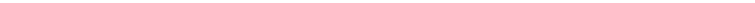
| Category | Series 0 |
|---|---|
| 2002-09-30 | 59.233 |
| 2003-09-30 | 60.724 |
| 2004-09-30 | 62.402 |
| 2005-09-30 | 65.523 |
| 2006-09-30 | 67.222 |
| 2007-09-30 | 68.557 |
| 2008-09-30 | 70.219 |
| 2009-09-30 | 70.824 |
| 2010-09-30 | 71.029 |
| 2011-09-30 | 68.922 |
| 2012-09-30 | 69.102 |
| 2013-09-30 | 70.356 |
| 2014-09-30 | 69.6 |
| 2015-09-30 | 69.2 |
| 2016-09-30 | 68.8 |